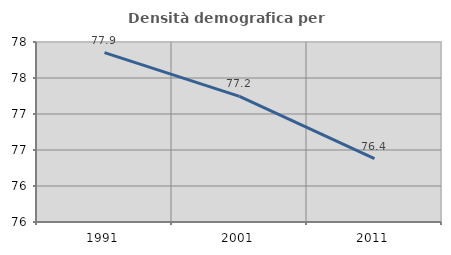
| Category | Densità demografica |
|---|---|
| 1991.0 | 77.852 |
| 2001.0 | 77.245 |
| 2011.0 | 76.381 |